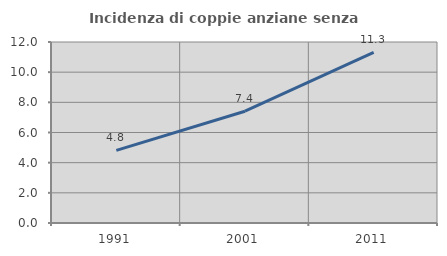
| Category | Incidenza di coppie anziane senza figli  |
|---|---|
| 1991.0 | 4.815 |
| 2001.0 | 7.413 |
| 2011.0 | 11.306 |